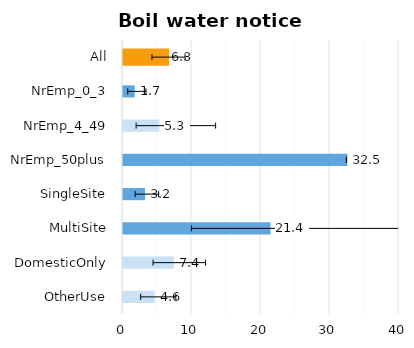
| Category | Series 0 |
|---|---|
| All | 6.3 |
| NrEmp_0_3 | 1.696 |
| NrEmp_4_49 | 5.269 |
| NrEmp_50plus | 32.521 |
| SingleSite | 3.184 |
| MultiSite | 21.375 |
| DomesticOnly | 7.379 |
| OtherUse | 4.591 |